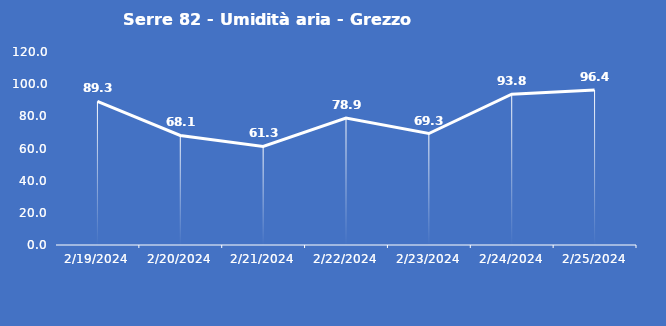
| Category | Serre 82 - Umidità aria - Grezzo (%) |
|---|---|
| 2/19/24 | 89.3 |
| 2/20/24 | 68.1 |
| 2/21/24 | 61.3 |
| 2/22/24 | 78.9 |
| 2/23/24 | 69.3 |
| 2/24/24 | 93.8 |
| 2/25/24 | 96.4 |